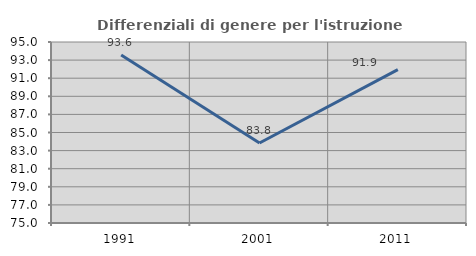
| Category | Differenziali di genere per l'istruzione superiore |
|---|---|
| 1991.0 | 93.567 |
| 2001.0 | 83.844 |
| 2011.0 | 91.945 |